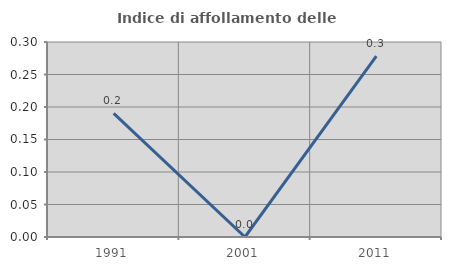
| Category | Indice di affollamento delle abitazioni  |
|---|---|
| 1991.0 | 0.19 |
| 2001.0 | 0 |
| 2011.0 | 0.278 |